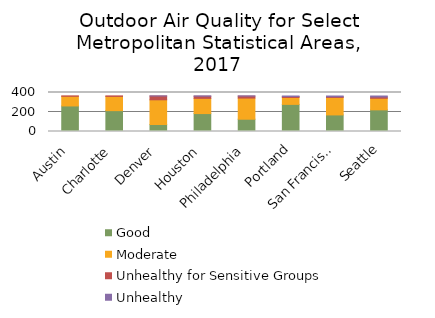
| Category | Good | Moderate | Unhealthy for Sensitive Groups | Unhealthy   |
|---|---|---|---|---|
| Austin | 262 | 99 | 4 | 0 |
| Charlotte | 214 | 146 | 5 | 0 |
| Denver | 72 | 253 | 39 | 1 |
| Houston | 184 | 156 | 22 | 3 |
| Philadelphia | 126 | 217 | 20 | 2 |
| Portland | 278 | 71 | 10 | 5 |
| San Francisco | 170 | 179 | 8 | 7 |
| Seattle | 222 | 119 | 13 | 10 |